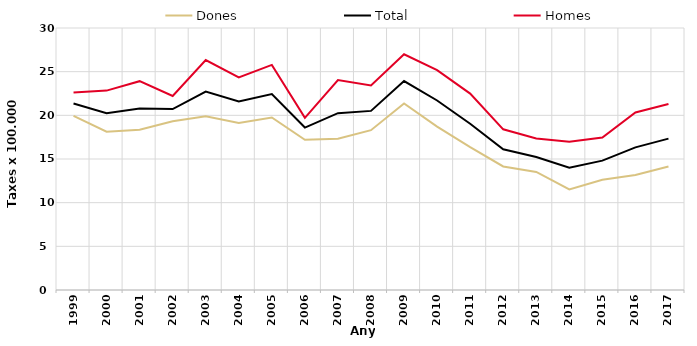
| Category | Dones | Total | Homes |
|---|---|---|---|
| 1999.0 | 19.93 | 21.36 | 22.62 |
| 2000.0 | 18.12 | 20.24 | 22.83 |
| 2001.0 | 18.36 | 20.77 | 23.91 |
| 2002.0 | 19.33 | 20.72 | 22.21 |
| 2003.0 | 19.88 | 22.72 | 26.33 |
| 2004.0 | 19.13 | 21.6 | 24.34 |
| 2005.0 | 19.75 | 22.44 | 25.78 |
| 2006.0 | 17.2 | 18.6 | 19.71 |
| 2007.0 | 17.31 | 20.25 | 24.03 |
| 2008.0 | 18.3 | 20.51 | 23.41 |
| 2009.0 | 21.35 | 23.92 | 26.99 |
| 2010.0 | 18.71 | 21.7 | 25.18 |
| 2011.0 | 16.35 | 19.03 | 22.49 |
| 2012.0 | 14.15 | 16.12 | 18.4 |
| 2013.0 | 13.52 | 15.23 | 17.36 |
| 2014.0 | 11.52 | 13.99 | 16.97 |
| 2015.0 | 12.62 | 14.81 | 17.45 |
| 2016.0 | 13.16 | 16.33 | 20.32 |
| 2017.0 | 14.14 | 17.33 | 21.3 |